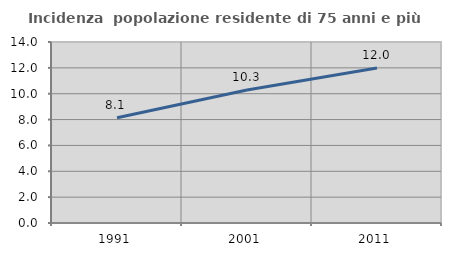
| Category | Incidenza  popolazione residente di 75 anni e più |
|---|---|
| 1991.0 | 8.144 |
| 2001.0 | 10.289 |
| 2011.0 | 11.987 |